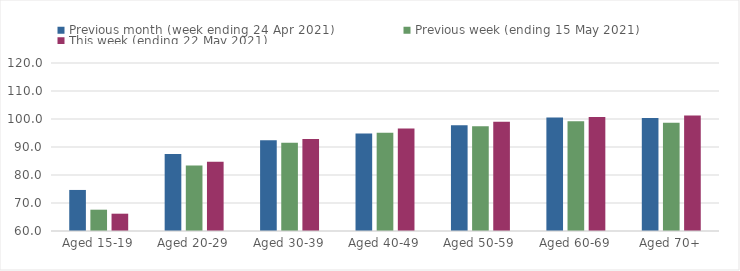
| Category | Previous month (week ending 24 Apr 2021) | Previous week (ending 15 May 2021) | This week (ending 22 May 2021) |
|---|---|---|---|
| Aged 15-19 | 74.66 | 67.61 | 66.18 |
| Aged 20-29 | 87.51 | 83.36 | 84.71 |
| Aged 30-39 | 92.4 | 91.48 | 92.82 |
| Aged 40-49 | 94.79 | 95.13 | 96.62 |
| Aged 50-59 | 97.76 | 97.39 | 99.05 |
| Aged 60-69 | 100.54 | 99.18 | 100.71 |
| Aged 70+ | 100.35 | 98.7 | 101.27 |